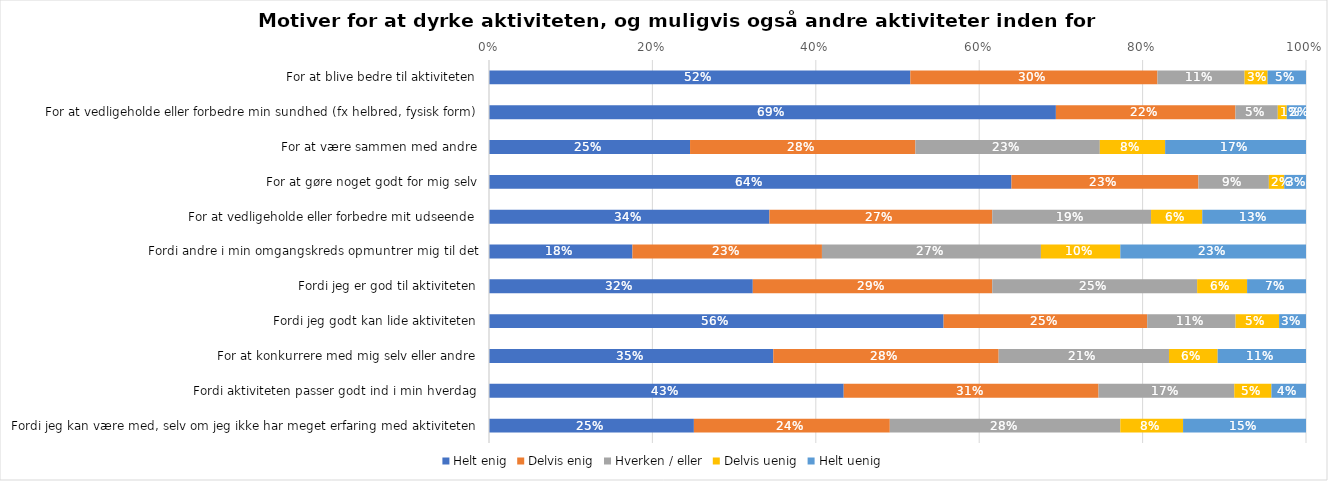
| Category | Helt enig | Delvis enig | Hverken / eller | Delvis uenig | Helt uenig |
|---|---|---|---|---|---|
| For at blive bedre til aktiviteten | 0.516 | 0.303 | 0.107 | 0.028 | 0.047 |
| For at vedligeholde eller forbedre min sundhed (fx helbred, fysisk form) | 0.694 | 0.22 | 0.052 | 0.011 | 0.024 |
| For at være sammen med andre | 0.246 | 0.276 | 0.226 | 0.08 | 0.172 |
| For at gøre noget godt for mig selv | 0.639 | 0.229 | 0.086 | 0.019 | 0.027 |
| For at vedligeholde eller forbedre mit udseende | 0.343 | 0.273 | 0.194 | 0.063 | 0.127 |
| Fordi andre i min omgangskreds opmuntrer mig til det | 0.176 | 0.232 | 0.268 | 0.097 | 0.227 |
| Fordi jeg er god til aktiviteten | 0.323 | 0.293 | 0.251 | 0.061 | 0.072 |
| Fordi jeg godt kan lide aktiviteten | 0.556 | 0.249 | 0.108 | 0.053 | 0.033 |
| For at konkurrere med mig selv eller andre | 0.348 | 0.276 | 0.208 | 0.06 | 0.108 |
| Fordi aktiviteten passer godt ind i min hverdag | 0.434 | 0.312 | 0.166 | 0.045 | 0.042 |
| Fordi jeg kan være med, selv om jeg ikke har meget erfaring med aktiviteten | 0.251 | 0.24 | 0.282 | 0.077 | 0.15 |